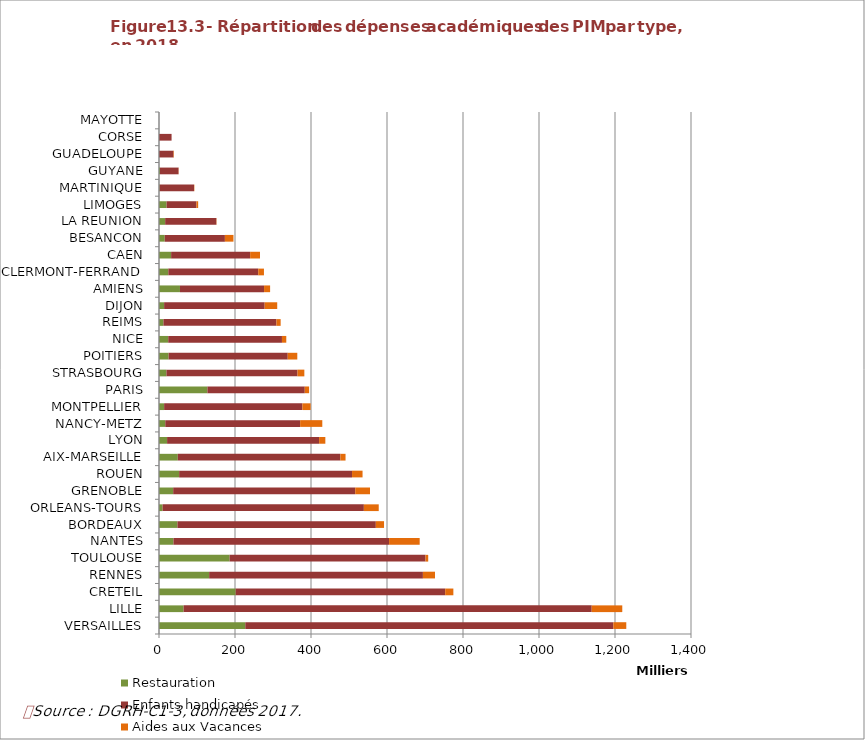
| Category | Restauration | Enfants handicapés | Aides aux Vacances |
|---|---|---|---|
| VERSAILLES | 227059 | 968562 | 34079 |
| LILLE | 64739 | 1073976 | 80443 |
| CRETEIL | 201803 | 551316 | 21522 |
| RENNES | 131976 | 562526 | 31859 |
| TOULOUSE | 185866 | 515479 | 7098 |
| NANTES | 37984 | 567450 | 80593 |
| BORDEAUX | 48497 | 522101 | 21610 |
| ORLEANS-TOURS | 9353 | 529774 | 39119 |
| GRENOBLE | 37324 | 479069 | 38868 |
| ROUEN | 53015 | 454958 | 27694 |
| AIX-MARSEILLE | 49479 | 427834 | 13579 |
| LYON | 21307 | 400054 | 16388 |
| NANCY-METZ | 16528 | 354896 | 58315 |
| MONTPELLIER | 13507 | 363752 | 21779 |
| PARIS | 127348 | 256239 | 11434 |
| STRASBOURG | 19516 | 345018 | 17944 |
| POITIERS | 25229 | 313571 | 25140 |
| NICE | 24290 | 299301 | 11377 |
| REIMS | 11630 | 297418 | 11097 |
| DIJON | 13475 | 264595 | 33036 |
| AMIENS | 55184 | 221274 | 15927 |
| CLERMONT-FERRAND | 24514 | 236637 | 15046 |
| CAEN | 31923 | 207906 | 26043 |
| BESANCON | 15122 | 158295 | 22542 |
| LA REUNION | 16192 | 134712 | 707 |
| LIMOGES | 19897 | 78610 | 4548 |
| MARTINIQUE | 1493 | 90678 | 874 |
| GUYANE | 2611 | 48865 | 386 |
| GUADELOUPE | 0 | 38180 | 1220 |
| CORSE | 0 | 33085 | 0 |
| MAYOTTE | 0 | 0 | 0 |